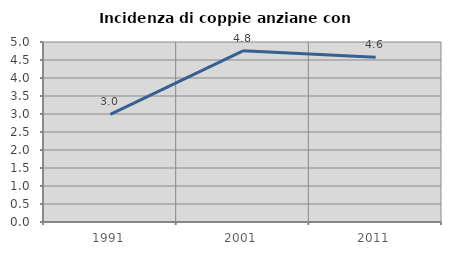
| Category | Incidenza di coppie anziane con figli |
|---|---|
| 1991.0 | 2.99 |
| 2001.0 | 4.755 |
| 2011.0 | 4.578 |